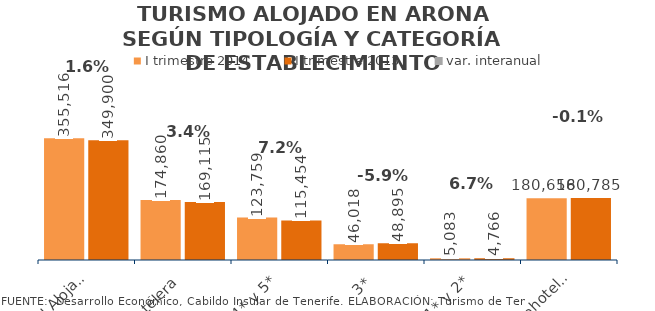
| Category | I trimestre 2014 | I trimestre 2013 |
|---|---|---|
| Total Alojados | 355516 | 349900 |
| Hotelera | 174860 | 169115 |
| 4* y 5* | 123759 | 115454 |
| 3* | 46018 | 48895 |
| 1* y 2* | 5083 | 4766 |
| Extrahotelera | 180656 | 180785 |